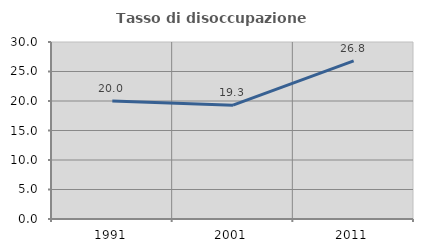
| Category | Tasso di disoccupazione giovanile  |
|---|---|
| 1991.0 | 20 |
| 2001.0 | 19.298 |
| 2011.0 | 26.786 |